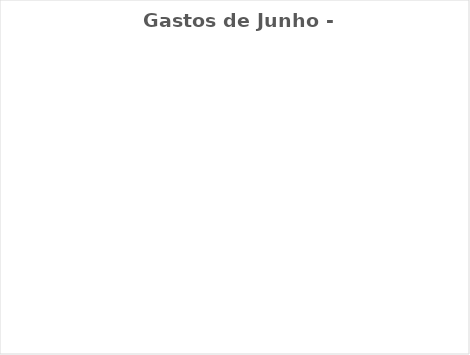
| Category | Gastos de Junho - Real |
|---|---|
| Despesas Mensais | 0 |
| Aposentadoria/Pagar à si | 0 |
| Gratidão/ Doação/ Dizimo | 0 |
| Desejos | 0 |
| Dívidas/Investimentos | 0 |